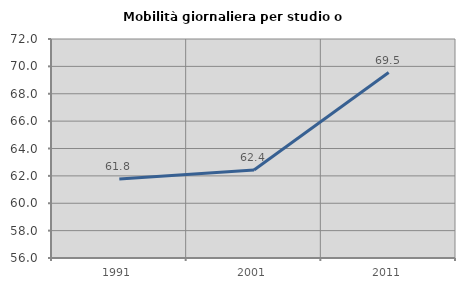
| Category | Mobilità giornaliera per studio o lavoro |
|---|---|
| 1991.0 | 61.776 |
| 2001.0 | 62.429 |
| 2011.0 | 69.547 |